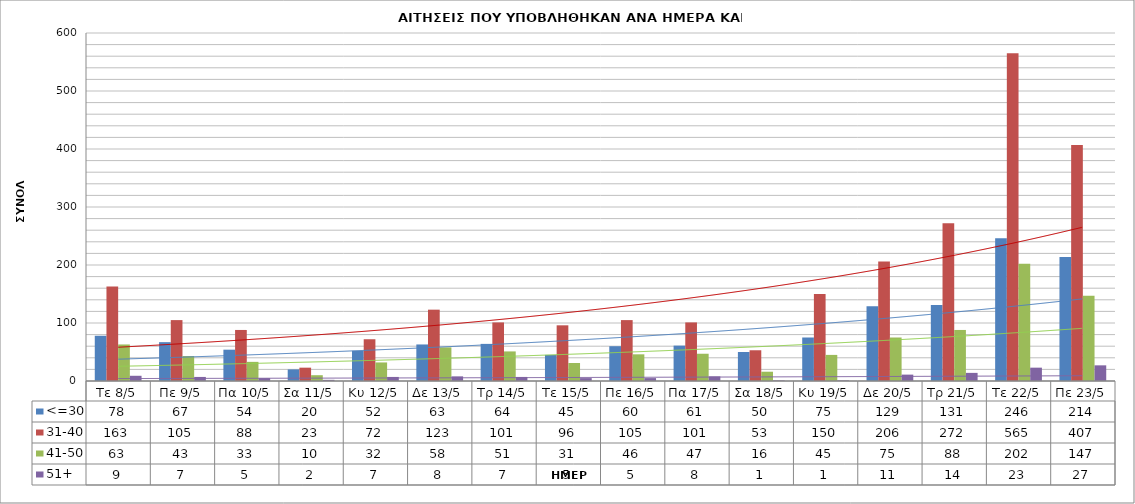
| Category | <=30 | 31-40 | 41-50 | 51+ |
|---|---|---|---|---|
| Τε 8/5 | 78 | 163 | 63 | 9 |
| Πε 9/5 | 67 | 105 | 43 | 7 |
| Πα 10/5 | 54 | 88 | 33 | 5 |
| Σα 11/5 | 20 | 23 | 10 | 2 |
| Κυ 12/5 | 52 | 72 | 32 | 7 |
| Δε 13/5 | 63 | 123 | 58 | 8 |
| Τρ 14/5 | 64 | 101 | 51 | 7 |
| Τε 15/5 | 45 | 96 | 31 | 5 |
| Πε 16/5 | 60 | 105 | 46 | 5 |
| Πα 17/5 | 61 | 101 | 47 | 8 |
| Σα 18/5 | 50 | 53 | 16 | 1 |
| Κυ 19/5 | 75 | 150 | 45 | 1 |
| Δε 20/5 | 129 | 206 | 75 | 11 |
| Τρ 21/5 | 131 | 272 | 88 | 14 |
| Τε 22/5 | 246 | 565 | 202 | 23 |
| Πε 23/5 | 214 | 407 | 147 | 27 |